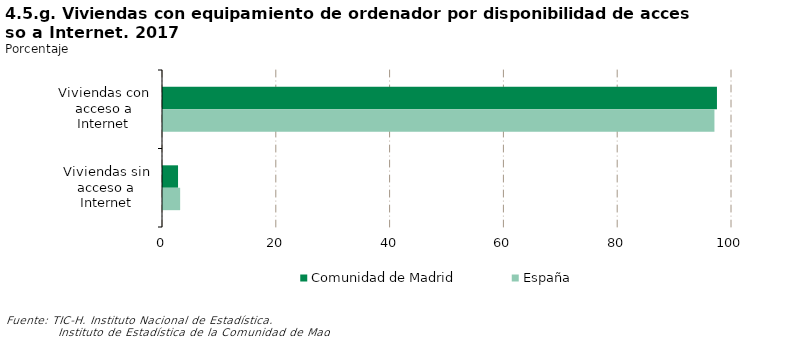
| Category | Comunidad de Madrid | España |
|---|---|---|
| Viviendas con acceso a Internet | 97.356 | 96.914 |
| Viviendas sin acceso a Internet | 2.644 | 3.015 |